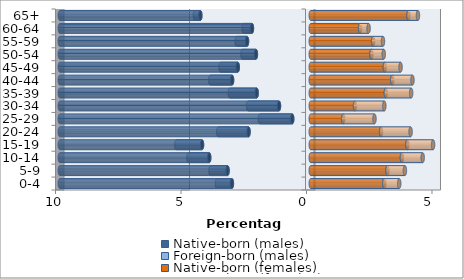
| Category | Native-born (males) | Foreign-born (males) | Native-born (females) | Foreign-born (females) |
|---|---|---|---|---|
| 0-4 | -3.141 | -0.595 | 2.931 | 0.595 |
| 5-9 | -3.315 | -0.678 | 3.059 | 0.693 |
| 10-14 | -4.046 | -0.829 | 3.631 | 0.829 |
| 15-19 | -4.332 | -1.025 | 3.85 | 1.025 |
| 20-24 | -2.479 | -1.205 | 2.802 | 1.175 |
| 25-29 | -0.738 | -1.288 | 1.296 | 1.243 |
| 30-34 | -1.266 | -1.228 | 1.763 | 1.168 |
| 35-39 | -2.155 | -1.07 | 2.991 | 1.009 |
| 40-44 | -3.134 | -0.866 | 3.247 | 0.806 |
| 45-49 | -2.908 | -0.686 | 2.953 | 0.625 |
| 50-54 | -2.185 | -0.535 | 2.418 | 0.49 |
| 55-59 | -2.539 | -0.414 | 2.486 | 0.392 |
| 60-64 | -2.343 | -0.331 | 1.966 | 0.339 |
| 65+ | -4.4 | -0.218 | 3.895 | 0.377 |